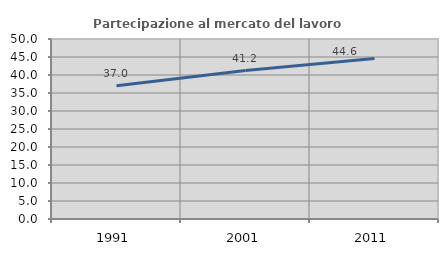
| Category | Partecipazione al mercato del lavoro  femminile |
|---|---|
| 1991.0 | 37.022 |
| 2001.0 | 41.232 |
| 2011.0 | 44.598 |